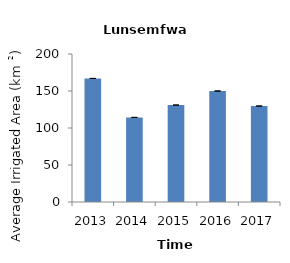
| Category | Lunsemfwa  |
|---|---|
| 2013.0 | 167 |
| 2014.0 | 114.333 |
| 2015.0 | 131 |
| 2016.0 | 150 |
| 2017.0 | 129.667 |